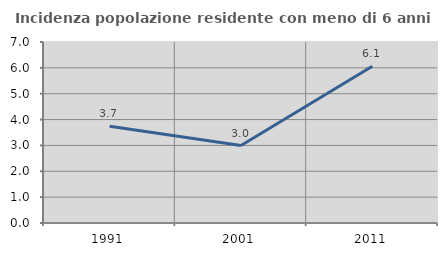
| Category | Incidenza popolazione residente con meno di 6 anni |
|---|---|
| 1991.0 | 3.74 |
| 2001.0 | 2.995 |
| 2011.0 | 6.061 |